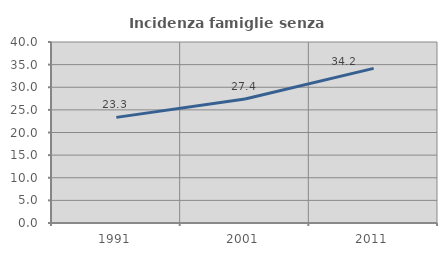
| Category | Incidenza famiglie senza nuclei |
|---|---|
| 1991.0 | 23.34 |
| 2001.0 | 27.401 |
| 2011.0 | 34.179 |